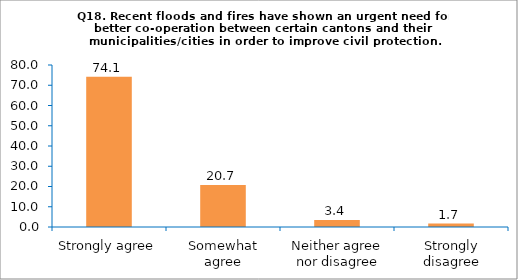
| Category | Series 0 |
|---|---|
| Strongly agree | 74.138 |
| Somewhat agree | 20.69 |
| Neither agree nor disagree | 3.448 |
| Strongly disagree | 1.724 |